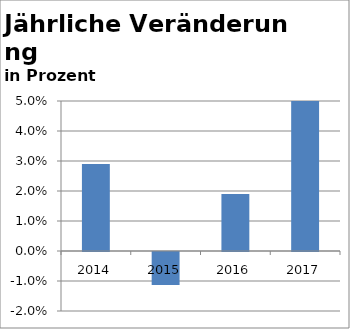
| Category | BIP |
|---|---|
| 2014.0 | 0.029 |
| 2015.0 | -0.011 |
| 2016.0 | 0.019 |
| 2017.0 | 0.05 |